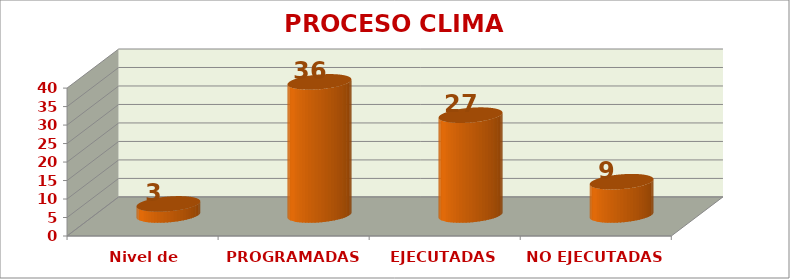
| Category | PROCESO CLIMA ESCOLAR |
|---|---|
| Nivel de satisfacción | 3 |
| PROGRAMADAS | 36 |
| EJECUTADAS | 27 |
| NO EJECUTADAS | 9 |